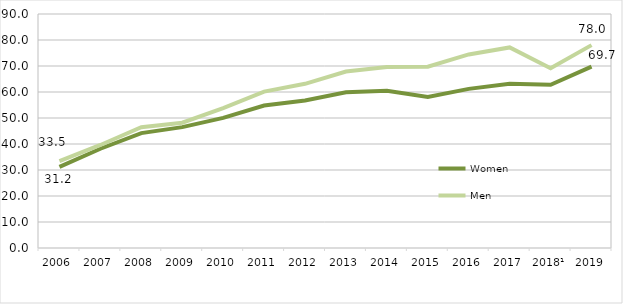
| Category | Women | Men |
|---|---|---|
| 2006 | 31.204 | 33.453 |
| 2007 | 38.179 | 39.626 |
| 2008 | 44.188 | 46.434 |
| 2009 | 46.489 | 48.197 |
| 2010 | 50.049 | 53.792 |
| 2011 | 54.792 | 60.148 |
| 2012 | 56.765 | 63.157 |
| 2013 | 59.891 | 67.86 |
| 2014 | 60.498 | 69.624 |
| 2015 | 58.063 | 69.725 |
| 2016 | 61.203 | 74.447 |
| 2017 | 63.153 | 77.143 |
| 2018¹ | 62.792 | 69.12 |
| 2019 | 69.73 | 78.029 |